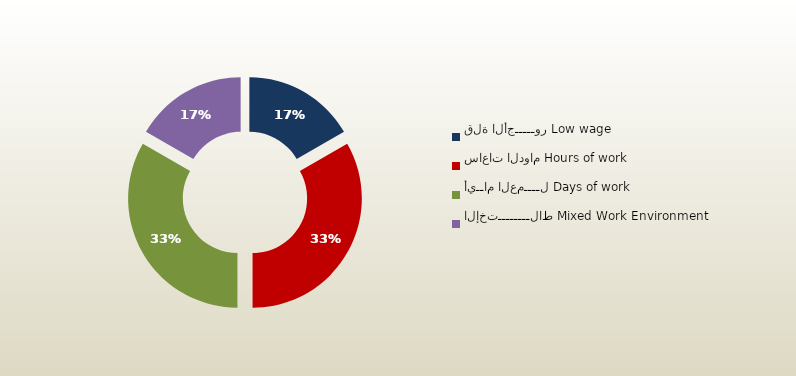
| Category | المجموع
Total |
|---|---|
| قلة الأجـــــور Low wage | 56 |
| ساعات الدوام Hours of work | 112 |
| أيــام العمــــل Days of work | 112 |
| الإختــــــــلاط Mixed Work Environment | 56 |